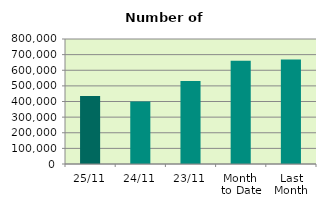
| Category | Series 0 |
|---|---|
| 25/11 | 435408 |
| 24/11 | 400660 |
| 23/11 | 531014 |
| Month 
to Date | 660465.579 |
| Last
Month | 669366.857 |